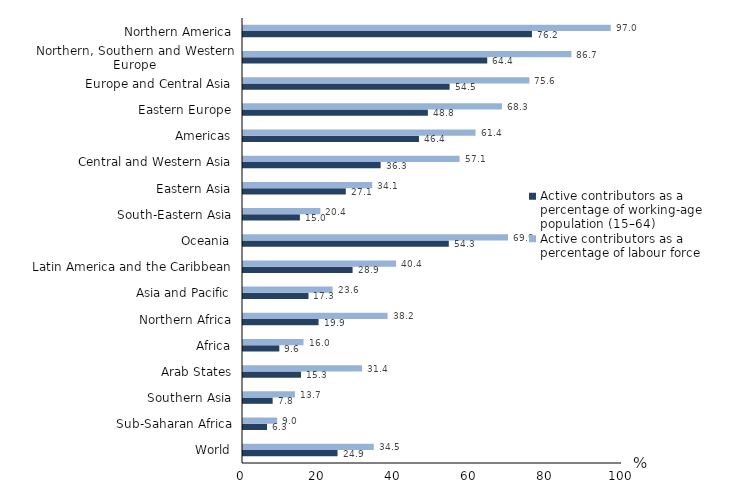
| Category | Active contributors as a percentage of working-age population (15–64) | Active contributors as a percentage of labour force |
|---|---|---|
| World | 24.944 | 34.506 |
| Sub-Saharan Africa | 6.337 | 9.018 |
| Southern Asia | 7.824 | 13.71 |
| Arab States | 15.307 | 31.417 |
| Africa | 9.581 | 15.969 |
| Northern Africa | 19.938 | 38.152 |
| Asia and Pacific | 17.275 | 23.625 |
| Latin America and the Caribbean | 28.916 | 40.404 |
| Oceania | 54.304 | 69.924 |
| South-Eastern Asia | 15.013 | 20.413 |
| Eastern Asia | 27.128 | 34.106 |
| Central and Western Asia | 36.316 | 57.141 |
| Americas | 46.426 | 61.363 |
| Eastern Europe | 48.779 | 68.323 |
| Europe and Central Asia | 54.511 | 75.564 |
| Northern, Southern and Western Europe | 64.445 | 86.651 |
| Northern America | 76.238 | 97.029 |